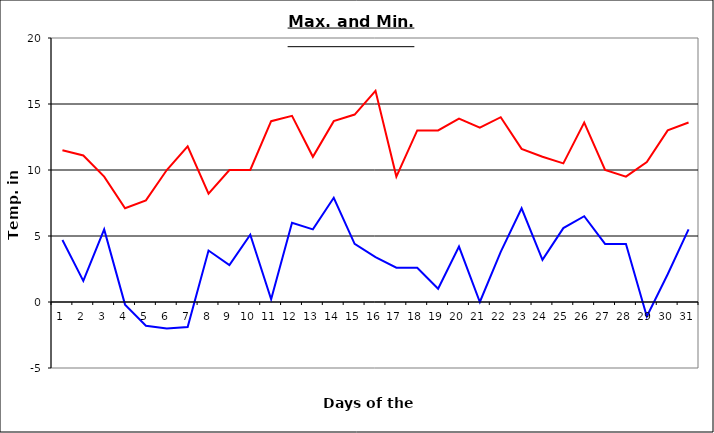
| Category | Series 0 | Series 1 |
|---|---|---|
| 0 | 11.5 | 4.7 |
| 1 | 11.1 | 1.6 |
| 2 | 9.5 | 5.5 |
| 3 | 7.1 | -0.2 |
| 4 | 7.7 | -1.8 |
| 5 | 10 | -2 |
| 6 | 11.8 | -1.9 |
| 7 | 8.2 | 3.9 |
| 8 | 10 | 2.8 |
| 9 | 10 | 5.1 |
| 10 | 13.7 | 0.2 |
| 11 | 14.1 | 6 |
| 12 | 11 | 5.5 |
| 13 | 13.7 | 7.9 |
| 14 | 14.2 | 4.4 |
| 15 | 16 | 3.4 |
| 16 | 9.5 | 2.6 |
| 17 | 13 | 2.6 |
| 18 | 13 | 1 |
| 19 | 13.9 | 4.2 |
| 20 | 13.2 | 0 |
| 21 | 14 | 3.8 |
| 22 | 11.6 | 7.1 |
| 23 | 11 | 3.2 |
| 24 | 10.5 | 5.6 |
| 25 | 13.6 | 6.5 |
| 26 | 10 | 4.4 |
| 27 | 9.5 | 4.4 |
| 28 | 10.6 | -1.1 |
| 29 | 13 | 2.1 |
| 30 | 13.6 | 5.5 |